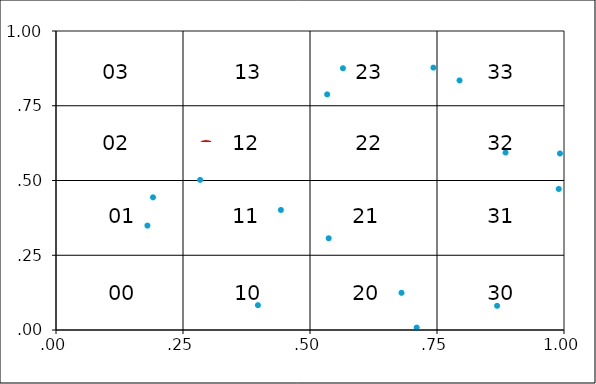
| Category | Series 0 |
|---|---|
| 0.709978693768253 | 0.008 |
| 0.536811613152192 | 0.307 |
| 0.884927660961325 | 0.594 |
| 0.17996806368445 | 0.349 |
| 0.442697046758955 | 0.402 |
| 0.564837421607097 | 0.875 |
| 0.533756335427842 | 0.788 |
| 0.742921634312924 | 0.878 |
| 0.989645589910435 | 0.472 |
| 0.868261219251537 | 0.081 |
| 0.283735981742582 | 0.502 |
| 0.680158179912575 | 0.124 |
| 0.190963402495171 | 0.444 |
| 0.794350407683716 | 0.835 |
| 0.397496828240034 | 0.083 |
| 0.992053065564541 | 0.59 |